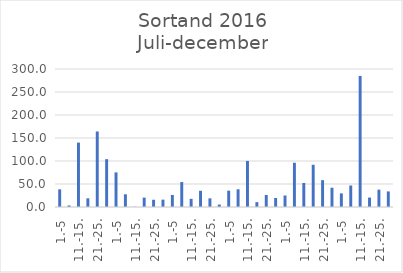
| Category | Series 0 |
|---|---|
| 1.-5 | 38.402 |
| 6.-10. | 3.353 |
| 11.-15. | 140 |
| 16.-20. | 18.893 |
| 21.-25. | 164.209 |
| 26.-31. | 103.978 |
| 1.-5 | 75.262 |
| 6.-10. | 27.611 |
| 11.-15. | 0.456 |
| 16.-20. | 20.398 |
| 21.-25. | 15.774 |
| 26.-31. | 15.975 |
| 1.-5 | 26.175 |
| 6.-10. | 54.252 |
| 11.-15. | 17.738 |
| 16.-20. | 35.294 |
| 21.-25. | 18.775 |
| 26.-30. | 5.333 |
| 1.-5 | 35.528 |
| 6.-10. | 38.527 |
| 11.-15. | 100.137 |
| 16.-20. | 10.573 |
| 21.-25. | 26.149 |
| 26.-31. | 19.603 |
| 1.-5 | 25.052 |
| 6.-10. | 96.186 |
| 11.-15. | 52.143 |
| 16.-20. | 91.796 |
| 21.-25. | 58.353 |
| 26.-30. | 41.947 |
| 1.-5 | 29.64 |
| 6.-10. | 46.722 |
| 11.-15. | 284.949 |
| 16.-20. | 20.5 |
| 21.-25. | 37.683 |
| 26.-31. | 33.862 |